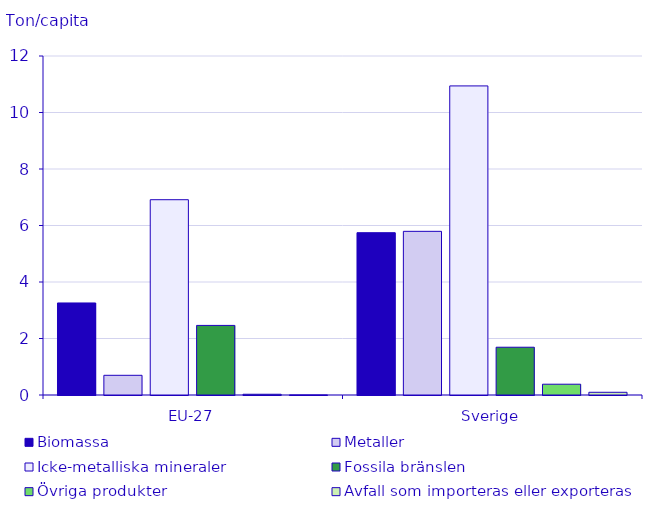
| Category | Biomassa | Metaller | Icke-metalliska mineraler | Fossila bränslen | Övriga produkter | Avfall som importeras eller exporteras |
|---|---|---|---|---|---|---|
| EU-27 | 3.258 | 0.697 | 6.913 | 2.463 | 0.026 | 0.002 |
| Sverige | 5.745 | 5.793 | 10.941 | 1.691 | 0.382 | 0.096 |